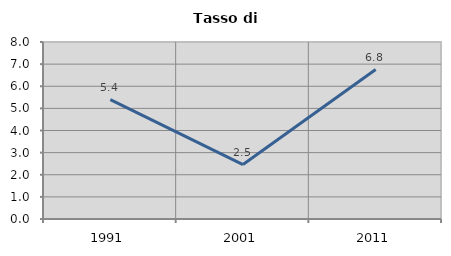
| Category | Tasso di disoccupazione   |
|---|---|
| 1991.0 | 5.391 |
| 2001.0 | 2.459 |
| 2011.0 | 6.754 |